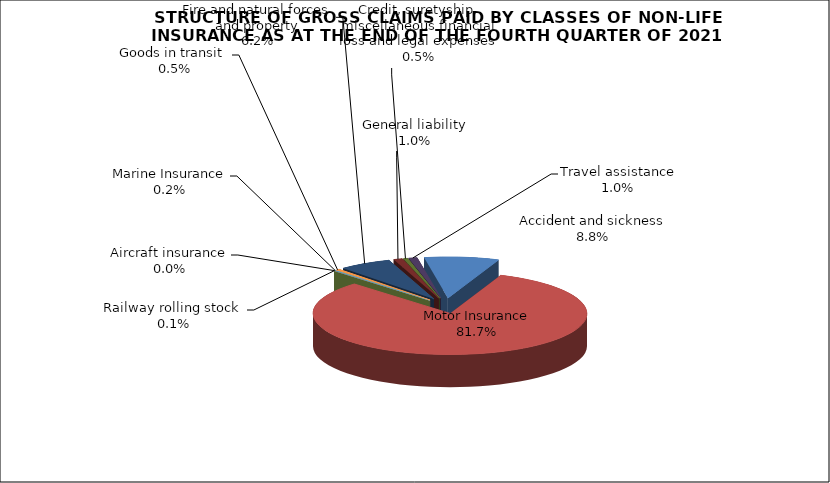
| Category | Accident and sickness |
|---|---|
| Accident and sickness | 0.088 |
| Motor Insurance | 0.817 |
| Railway rolling stock  | 0.001 |
| Aircraft insurance | 0 |
| Marine Insurance | 0.002 |
| Goods in transit  | 0.005 |
| Fire and natural forces and property | 0.062 |
| General liability | 0.01 |
| Credit, suretyship, miscellaneous financial loss and legal expenses | 0.005 |
| Travel assistance | 0.01 |